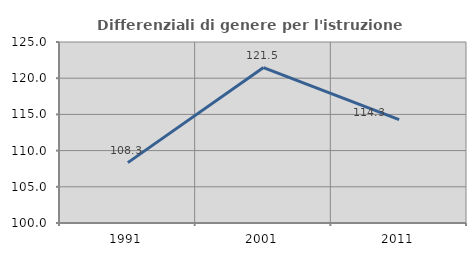
| Category | Differenziali di genere per l'istruzione superiore |
|---|---|
| 1991.0 | 108.34 |
| 2001.0 | 121.47 |
| 2011.0 | 114.29 |